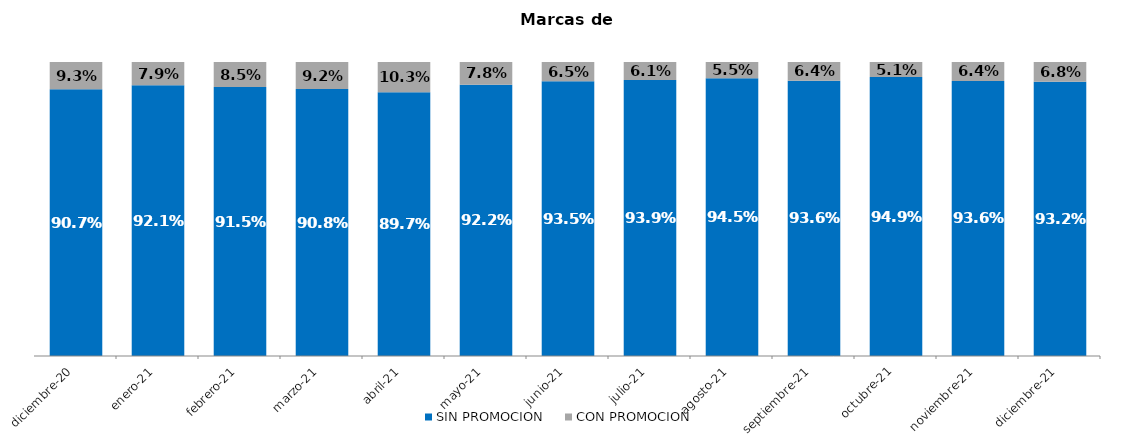
| Category | SIN PROMOCION   | CON PROMOCION   |
|---|---|---|
| 2020-12-01 | 0.907 | 0.093 |
| 2021-01-01 | 0.921 | 0.079 |
| 2021-02-01 | 0.915 | 0.085 |
| 2021-03-01 | 0.908 | 0.092 |
| 2021-04-01 | 0.897 | 0.103 |
| 2021-05-01 | 0.922 | 0.078 |
| 2021-06-01 | 0.935 | 0.065 |
| 2021-07-01 | 0.939 | 0.061 |
| 2021-08-01 | 0.945 | 0.055 |
| 2021-09-01 | 0.936 | 0.064 |
| 2021-10-01 | 0.949 | 0.051 |
| 2021-11-01 | 0.936 | 0.064 |
| 2021-12-01 | 0.932 | 0.068 |